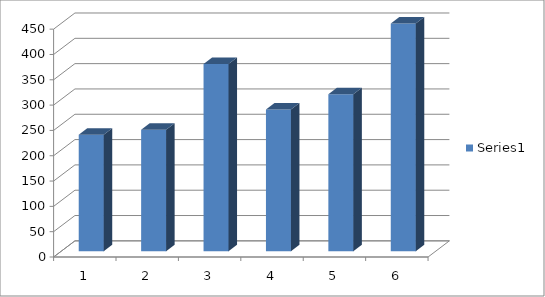
| Category | Series 0 |
|---|---|
| 0 | 230 |
| 1 | 240 |
| 2 | 370 |
| 3 | 280 |
| 4 | 310 |
| 5 | 450 |